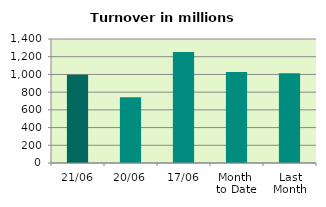
| Category | Series 0 |
|---|---|
| 21/06 | 997.562 |
| 20/06 | 741.921 |
| 17/06 | 1254.407 |
| Month 
to Date | 1028.344 |
| Last
Month | 1012.592 |